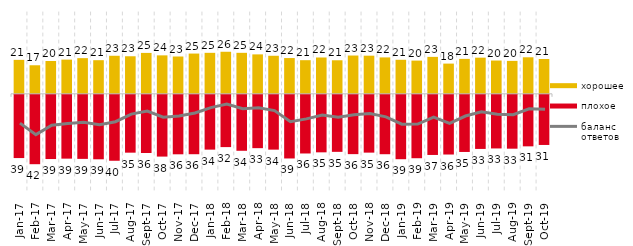
| Category | хорошее | плохое |
|---|---|---|
| 2017-01-01 | 20.75 | -38.65 |
| 2017-02-01 | 17.45 | -42.4 |
| 2017-03-01 | 20.05 | -39.25 |
| 2017-04-01 | 20.9 | -39 |
| 2017-05-01 | 21.8 | -39.15 |
| 2017-06-01 | 20.55 | -39.4 |
| 2017-07-01 | 23.25 | -40.3 |
| 2017-08-01 | 22.95 | -35.35 |
| 2017-09-01 | 25 | -35.55 |
| 2017-10-01 | 23.5 | -37.75 |
| 2017-11-01 | 22.8 | -36.35 |
| 2017-12-01 | 24.6 | -36.3 |
| 2018-01-01 | 25.05 | -33.5 |
| 2018-02-01 | 25.7 | -31.95 |
| 2018-03-01 | 25.05 | -34.2 |
| 2018-04-01 | 24.1 | -32.6 |
| 2018-05-01 | 23.25 | -33.5 |
| 2018-06-01 | 21.85 | -38.9 |
| 2018-07-01 | 20.55 | -35.85 |
| 2018-08-01 | 22.2 | -35.15 |
| 2018-09-01 | 20.5 | -34.85 |
| 2018-10-01 | 23.4 | -36.25 |
| 2018-11-01 | 23.303 | -35.329 |
| 2018-12-01 | 22.25 | -36.3 |
| 2019-01-01 | 20.8 | -39.35 |
| 2019-02-01 | 20.3 | -38.75 |
| 2019-03-01 | 22.576 | -36.748 |
| 2019-04-01 | 18.465 | -36.485 |
| 2019-05-01 | 21.347 | -34.918 |
| 2019-06-01 | 22.095 | -33.067 |
| 2019-07-01 | 20.347 | -32.772 |
| 2019-08-01 | 20.13 | -32.917 |
| 2019-09-01 | 22.327 | -31.485 |
| 2019-10-01 | 21.287 | -30.644 |